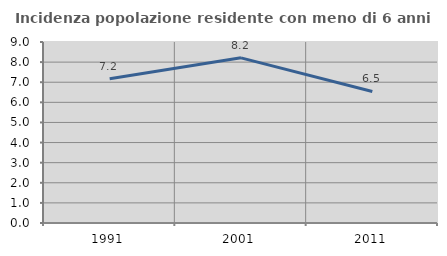
| Category | Incidenza popolazione residente con meno di 6 anni |
|---|---|
| 1991.0 | 7.17 |
| 2001.0 | 8.213 |
| 2011.0 | 6.541 |